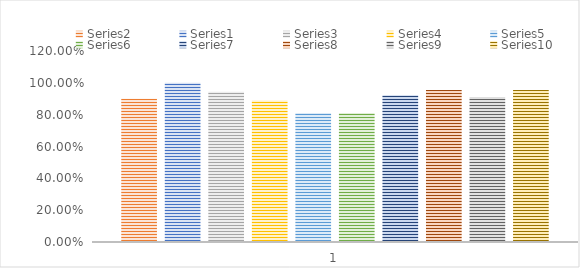
| Category | Series 1 | Series 0 | Series 2 | Series 3 | Series 4 | Series 5 | Series 6 | Series 7 | Series 8 | Series 9 |
|---|---|---|---|---|---|---|---|---|---|---|
| 0 | 0.9 | 1 | 0.944 | 0.889 | 0.811 | 0.811 | 0.922 | 0.956 | 0.911 | 0.956 |